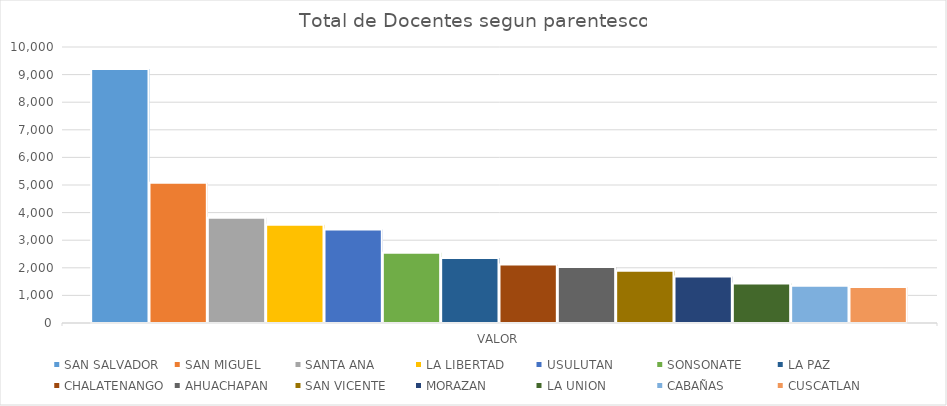
| Category | SAN SALVADOR | SAN MIGUEL | SANTA ANA | LA LIBERTAD | USULUTAN | SONSONATE | LA PAZ | CHALATENANGO | AHUACHAPAN | SAN VICENTE | MORAZAN | LA UNION | CABAÑAS | CUSCATLAN |
|---|---|---|---|---|---|---|---|---|---|---|---|---|---|---|
| VALOR | 9200 | 5078 | 3815 | 3557 | 3392 | 2546 | 2354 | 2119 | 2029 | 1893 | 1687 | 1434 | 1346 | 1305 |